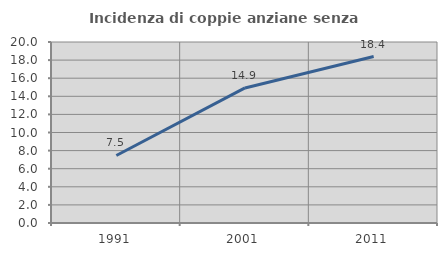
| Category | Incidenza di coppie anziane senza figli  |
|---|---|
| 1991.0 | 7.463 |
| 2001.0 | 14.925 |
| 2011.0 | 18.391 |